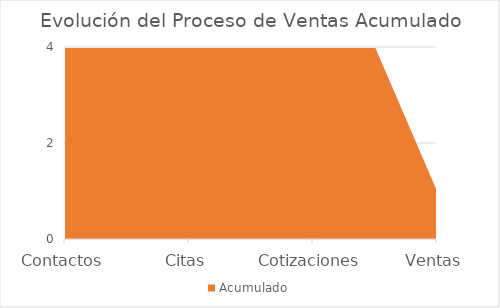
| Category | Acumulado |
|---|---|
| Contactos | 7 |
| Citas | 7 |
| Cotizaciones | 7 |
| Ventas | 1 |